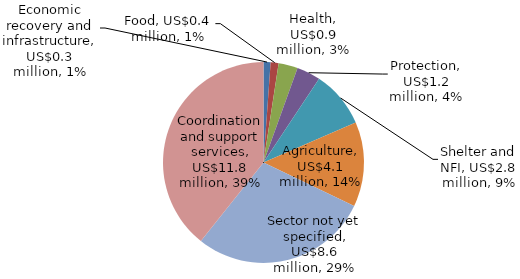
| Category | Series 0 |
|---|---|
| Economic recovery and infrastructure | 0.342 |
| Food | 0.385 |
| Health | 0.932 |
| Protection | 1.154 |
| Shelter and NFI | 2.762 |
| Agriculture | 4.111 |
| Sector not yet specified | 8.62 |
| Coordination and support services | 11.849 |